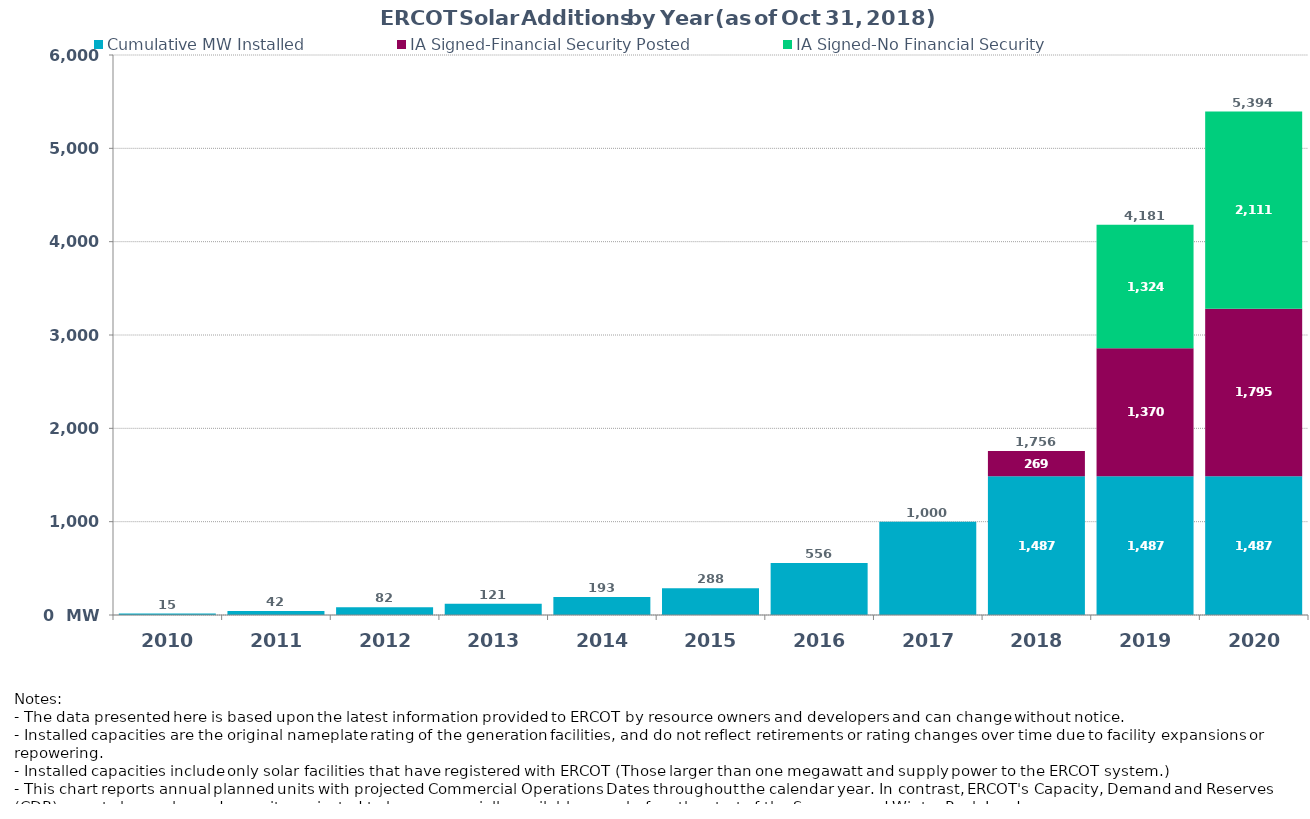
| Category | Cumulative MW Installed | IA Signed-Financial Security Posted  | IA Signed-No Financial Security  | Cumulative Installed and Planned |
|---|---|---|---|---|
| 2010.0 | 15 | 0 | 0 | 15 |
| 2011.0 | 42 | 0 | 0 | 42 |
| 2012.0 | 82 | 0 | 0 | 82 |
| 2013.0 | 121 | 0 | 0 | 121 |
| 2014.0 | 193 | 0 | 0 | 193 |
| 2015.0 | 287.7 | 0 | 0 | 287.7 |
| 2016.0 | 556 | 0 | 0 | 556 |
| 2017.0 | 1000 | 0 | 0 | 1000 |
| 2018.0 | 1487 | 269.4 | 0 | 1756.4 |
| 2019.0 | 1487 | 1370.2 | 1324 | 4181.2 |
| 2020.0 | 1487 | 1795.2 | 2111.3 | 5393.5 |